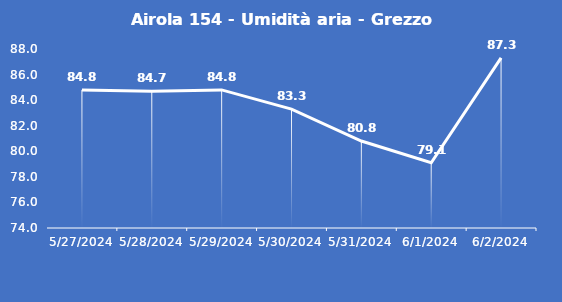
| Category | Airola 154 - Umidità aria - Grezzo (%) |
|---|---|
| 5/27/24 | 84.8 |
| 5/28/24 | 84.7 |
| 5/29/24 | 84.8 |
| 5/30/24 | 83.3 |
| 5/31/24 | 80.8 |
| 6/1/24 | 79.1 |
| 6/2/24 | 87.3 |